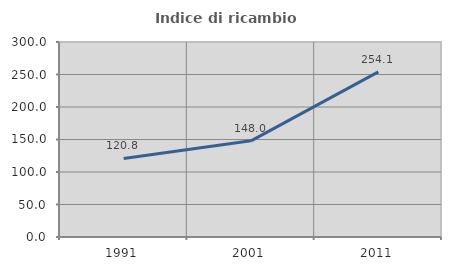
| Category | Indice di ricambio occupazionale  |
|---|---|
| 1991.0 | 120.792 |
| 2001.0 | 147.959 |
| 2011.0 | 254.098 |